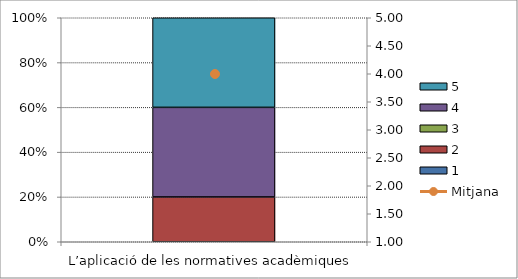
| Category | 1 | 2 | 3 | 4 | 5 |
|---|---|---|---|---|---|
| L’aplicació de les normatives acadèmiques | 0 | 1 | 0 | 2 | 2 |